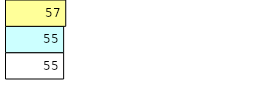
| Category | Total Standouts | Total Recd | Total Tipsters |
|---|---|---|---|
| 0 | 55 | 55 | 57 |